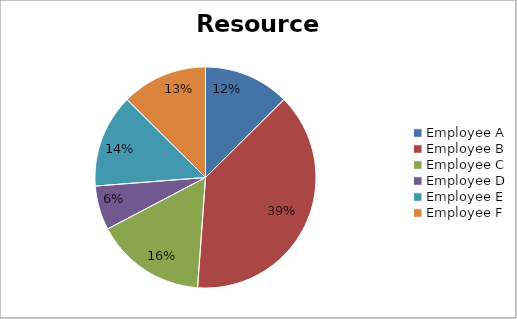
| Category | data |
|---|---|
| Employee A | 4950 |
| Employee B | 15225 |
| Employee C | 6375 |
| Employee D | 2550 |
| Employee E | 5400 |
| Employee F | 4950 |